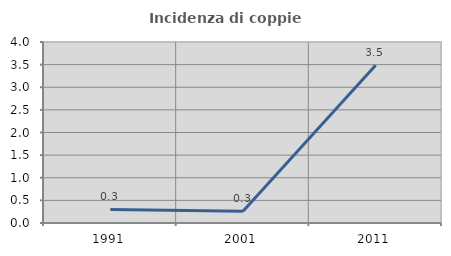
| Category | Incidenza di coppie miste |
|---|---|
| 1991.0 | 0.299 |
| 2001.0 | 0.26 |
| 2011.0 | 3.484 |